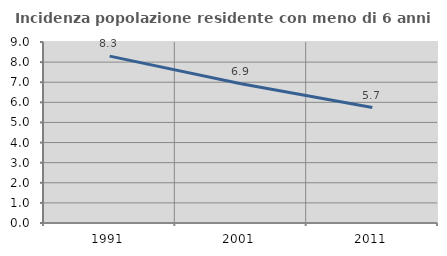
| Category | Incidenza popolazione residente con meno di 6 anni |
|---|---|
| 1991.0 | 8.298 |
| 2001.0 | 6.92 |
| 2011.0 | 5.743 |